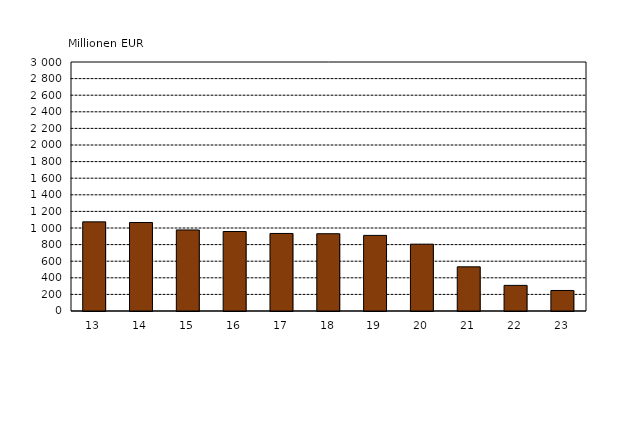
| Category | Series 0 |
|---|---|
| 13 | 1073.935 |
| 14 | 1066.223 |
| 15 | 976.55 |
| 16 | 957.676 |
| 17 | 934.155 |
| 18 | 931.067 |
| 19 | 910.886 |
| 20 | 805.167 |
| 21 | 532.146 |
| 22 | 308.652 |
| 23 | 247.356 |